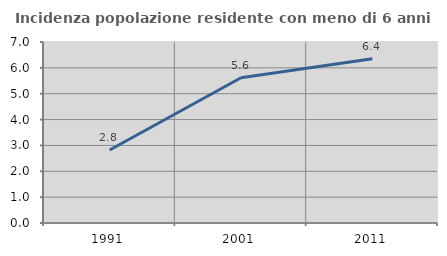
| Category | Incidenza popolazione residente con meno di 6 anni |
|---|---|
| 1991.0 | 2.824 |
| 2001.0 | 5.617 |
| 2011.0 | 6.356 |